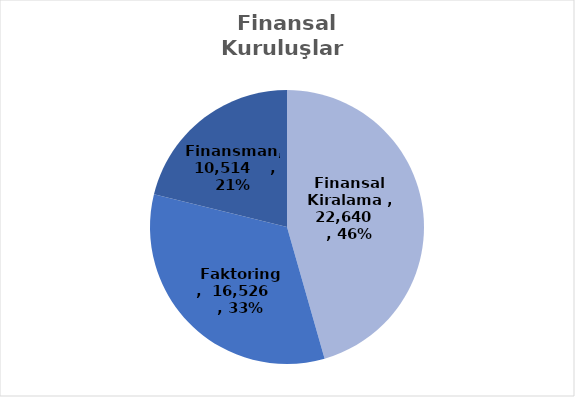
| Category | Series 0 |
|---|---|
| Finansal Kiralama  | 22640 |
| Faktoring  | 16526 |
| Finansman | 10514 |